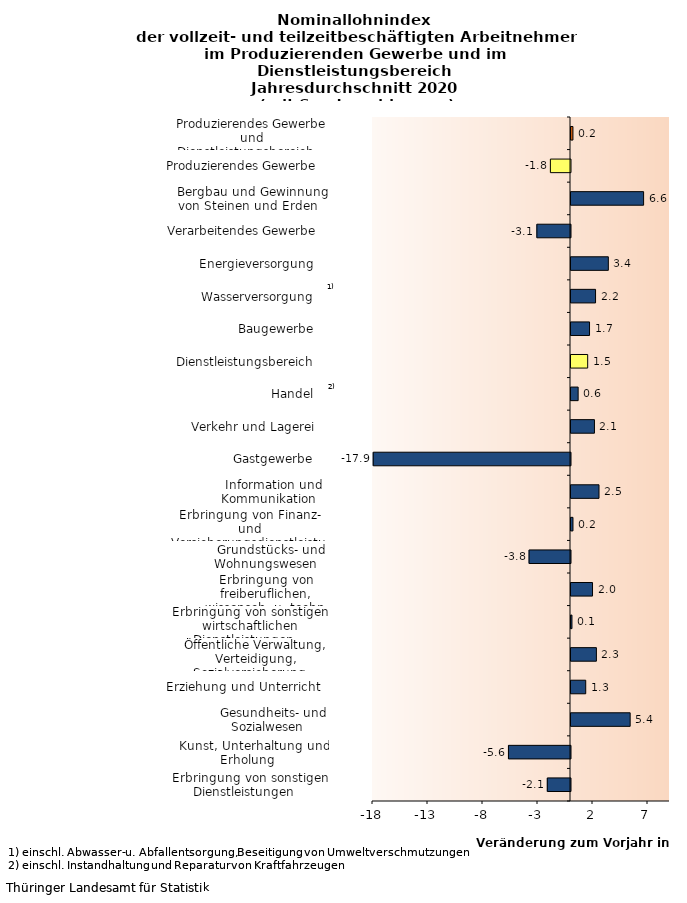
| Category | Series 0 |
|---|---|
| Erbringung von sonstigen Dienstleistungen    | -2.108 |
| Kunst, Unterhaltung und Erholung    | -5.64 |
| Gesundheits- und Sozialwesen    | 5.379 |
| Erziehung und Unterricht    | 1.338 |
| Öffentliche Verwaltung, Verteidigung, Sozialversicherung    | 2.309 |
| Erbringung von sonstigen wirtschaftlichen Dienstleistungen    | 0.088 |
| Erbringung von freiberuflichen, wissensch. u. techn. Dienstleistungen    | 1.957 |
| Grundstücks- und Wohnungswesen    | -3.765 |
| Erbringung von Finanz- und Versicherungsdienstleistungen    | 0.18 |
| Information und Kommunikation    | 2.545 |
| Gastgewerbe    | -17.936 |
| Verkehr und Lagerei    | 2.132 |
| Handel    | 0.649 |
| Dienstleistungsbereich    | 1.517 |
| Baugewerbe    | 1.685 |
| Wasserversorgung    | 2.232 |
| Energieversorgung    | 3.395 |
| Verarbeitendes Gewerbe    | -3.057 |
| Bergbau und Gewinnung von Steinen und Erden    | 6.599 |
| Produzierendes Gewerbe    | -1.829 |
| Produzierendes Gewerbe und Dienstleistungsbereich    | 0.177 |